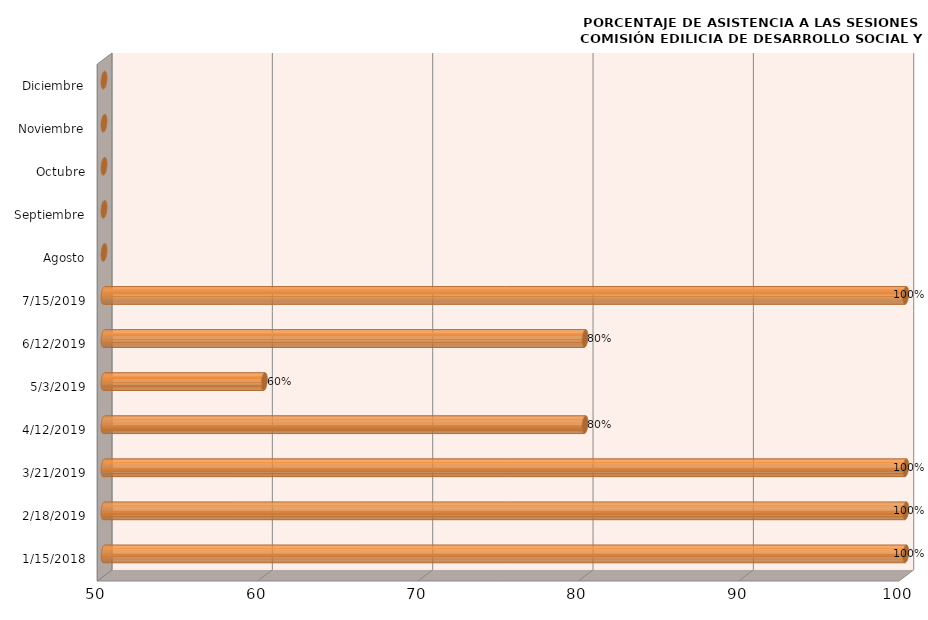
| Category | Series 0 |
|---|---|
| 15/01/2018 | 100 |
| 18/02/2019 | 100 |
| 21/03/2019 | 100 |
| 12/04/2019 | 80 |
| 03/05/2019 | 60 |
| 12/06/2019 | 80 |
| 15/07/2019 | 100 |
| Agosto | 0 |
| Septiembre | 0 |
| Octubre | 0 |
| Noviembre | 0 |
| Diciembre | 0 |